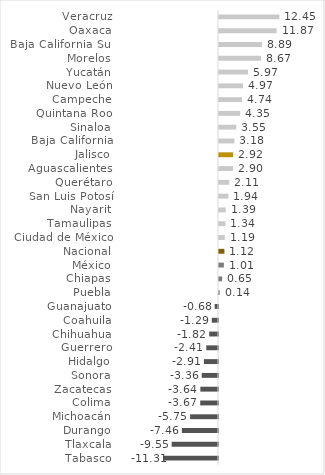
| Category | Series 0 |
|---|---|
| Tabasco | -11.309 |
| Tlaxcala | -9.548 |
| Durango | -7.458 |
| Michoacán | -5.752 |
| Colima | -3.665 |
| Zacatecas | -3.64 |
| Sonora | -3.357 |
| Hidalgo | -2.907 |
| Guerrero | -2.412 |
| Chihuahua | -1.82 |
| Coahuila | -1.295 |
| Guanajuato | -0.678 |
| Puebla | 0.137 |
| Chiapas | 0.654 |
| México | 1.005 |
| Nacional | 1.121 |
| Ciudad de México | 1.193 |
| Tamaulipas | 1.34 |
| Nayarit | 1.392 |
| San Luis Potosí | 1.94 |
| Querétaro | 2.11 |
| Aguascalientes | 2.9 |
| Jalisco | 2.925 |
| Baja California | 3.181 |
| Sinaloa | 3.551 |
| Quintana Roo | 4.354 |
| Campeche | 4.739 |
| Nuevo León | 4.973 |
| Yucatán | 5.969 |
| Morelos | 8.67 |
| Baja California Sur | 8.89 |
| Oaxaca | 11.873 |
| Veracruz | 12.448 |